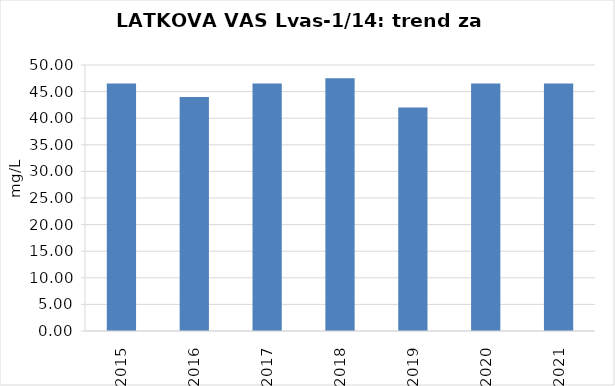
| Category | Vsota |
|---|---|
| 2015 | 46.5 |
| 2016 | 44 |
| 2017 | 46.5 |
| 2018 | 47.5 |
| 2019 | 42 |
| 2020 | 46.5 |
| 2021 | 46.5 |